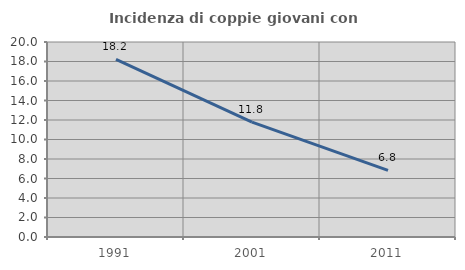
| Category | Incidenza di coppie giovani con figli |
|---|---|
| 1991.0 | 18.229 |
| 2001.0 | 11.783 |
| 2011.0 | 6.841 |